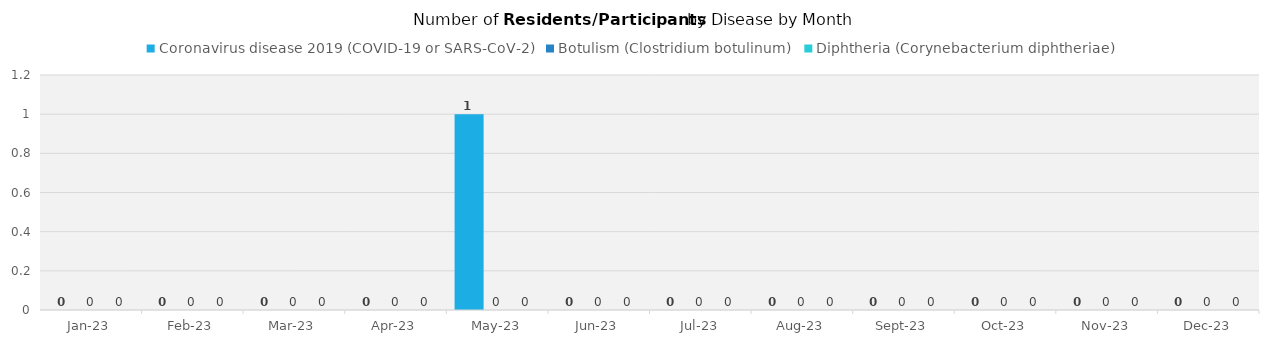
| Category | Coronavirus disease 2019 (COVID-19 or SARS-CoV-2)  | Botulism (Clostridium botulinum)  | Diphtheria (Corynebacterium diphtheriae)  |
|---|---|---|---|
| 2023-01-01 | 0 | 0 | 0 |
| 2023-02-01 | 0 | 0 | 0 |
| 2023-03-01 | 0 | 0 | 0 |
| 2023-04-01 | 0 | 0 | 0 |
| 2023-05-01 | 1 | 0 | 0 |
| 2023-06-01 | 0 | 0 | 0 |
| 2023-07-01 | 0 | 0 | 0 |
| 2023-08-01 | 0 | 0 | 0 |
| 2023-09-01 | 0 | 0 | 0 |
| 2023-10-01 | 0 | 0 | 0 |
| 2023-11-01 | 0 | 0 | 0 |
| 2023-12-01 | 0 | 0 | 0 |